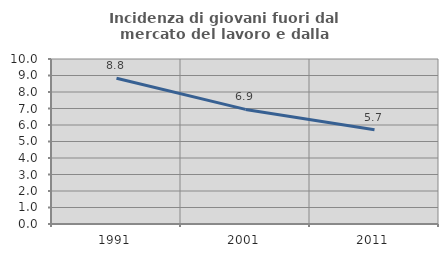
| Category | Incidenza di giovani fuori dal mercato del lavoro e dalla formazione  |
|---|---|
| 1991.0 | 8.837 |
| 2001.0 | 6.944 |
| 2011.0 | 5.714 |